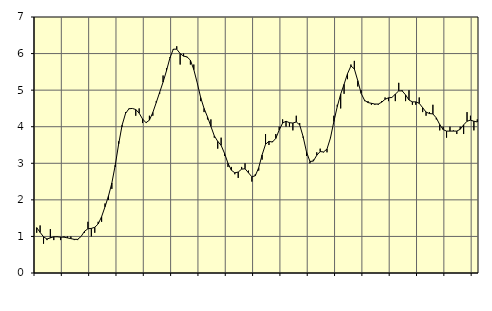
| Category | Piggar | Series 1 |
|---|---|---|
| nan | 1.1 | 1.24 |
| 87.0 | 1.3 | 1.11 |
| 87.0 | 0.8 | 0.99 |
| 87.0 | 0.9 | 0.93 |
| nan | 1.2 | 0.96 |
| 88.0 | 0.9 | 0.99 |
| 88.0 | 1 | 0.99 |
| 88.0 | 0.9 | 0.98 |
| nan | 1 | 0.98 |
| 89.0 | 1 | 0.96 |
| 89.0 | 1 | 0.94 |
| 89.0 | 0.9 | 0.92 |
| nan | 0.9 | 0.92 |
| 90.0 | 1 | 1 |
| 90.0 | 1.1 | 1.14 |
| 90.0 | 1.4 | 1.21 |
| nan | 1 | 1.22 |
| 91.0 | 1.1 | 1.25 |
| 91.0 | 1.4 | 1.34 |
| 91.0 | 1.4 | 1.54 |
| nan | 1.9 | 1.81 |
| 92.0 | 2 | 2.1 |
| 92.0 | 2.3 | 2.46 |
| 92.0 | 2.9 | 2.95 |
| nan | 3.6 | 3.53 |
| 93.0 | 4 | 4.04 |
| 93.0 | 4.4 | 4.36 |
| 93.0 | 4.5 | 4.49 |
| nan | 4.5 | 4.5 |
| 94.0 | 4.3 | 4.47 |
| 94.0 | 4.5 | 4.37 |
| 94.0 | 4.1 | 4.21 |
| nan | 4.1 | 4.11 |
| 95.0 | 4.3 | 4.18 |
| 95.0 | 4.3 | 4.39 |
| 95.0 | 4.7 | 4.66 |
| nan | 4.9 | 4.94 |
| 96.0 | 5.4 | 5.22 |
| 96.0 | 5.6 | 5.53 |
| 96.0 | 5.9 | 5.88 |
| nan | 6.1 | 6.12 |
| 97.0 | 6.2 | 6.12 |
| 97.0 | 5.7 | 6 |
| 97.0 | 6 | 5.93 |
| nan | 5.9 | 5.91 |
| 98.0 | 5.7 | 5.82 |
| 98.0 | 5.7 | 5.56 |
| 98.0 | 5.2 | 5.2 |
| nan | 4.7 | 4.8 |
| 99.0 | 4.4 | 4.5 |
| 99.0 | 4.2 | 4.27 |
| 99.0 | 4.2 | 4.01 |
| nan | 3.7 | 3.75 |
| 0.0 | 3.4 | 3.6 |
| 0.0 | 3.7 | 3.49 |
| 0.0 | 3.2 | 3.27 |
| nan | 2.9 | 3 |
| 1.0 | 2.9 | 2.81 |
| 1.0 | 2.7 | 2.74 |
| 1.0 | 2.6 | 2.76 |
| nan | 2.9 | 2.84 |
| 2.0 | 3 | 2.85 |
| 2.0 | 2.8 | 2.74 |
| 2.0 | 2.5 | 2.63 |
| nan | 2.7 | 2.66 |
| 3.0 | 2.8 | 2.88 |
| 3.0 | 3.1 | 3.23 |
| 3.0 | 3.8 | 3.52 |
| nan | 3.5 | 3.6 |
| 4.0 | 3.6 | 3.58 |
| 4.0 | 3.8 | 3.68 |
| 4.0 | 4 | 3.91 |
| nan | 4.2 | 4.1 |
| 5.0 | 4 | 4.15 |
| 5.0 | 4 | 4.11 |
| 5.0 | 3.9 | 4.1 |
| nan | 4.3 | 4.13 |
| 6.0 | 4.1 | 4.05 |
| 6.0 | 3.7 | 3.73 |
| 6.0 | 3.2 | 3.31 |
| nan | 3 | 3.05 |
| 7.0 | 3.1 | 3.06 |
| 7.0 | 3.3 | 3.22 |
| 7.0 | 3.4 | 3.32 |
| nan | 3.3 | 3.31 |
| 8.0 | 3.3 | 3.39 |
| 8.0 | 3.7 | 3.69 |
| 8.0 | 4.3 | 4.14 |
| nan | 4.6 | 4.55 |
| 9.0 | 4.5 | 4.89 |
| 9.0 | 4.9 | 5.16 |
| 9.0 | 5.3 | 5.45 |
| nan | 5.7 | 5.66 |
| 10.0 | 5.8 | 5.58 |
| 10.0 | 5.1 | 5.26 |
| 10.0 | 5 | 4.91 |
| nan | 4.7 | 4.72 |
| 11.0 | 4.7 | 4.66 |
| 11.0 | 4.6 | 4.64 |
| 11.0 | 4.6 | 4.62 |
| nan | 4.6 | 4.62 |
| 12.0 | 4.7 | 4.67 |
| 12.0 | 4.8 | 4.75 |
| 12.0 | 4.7 | 4.79 |
| nan | 4.8 | 4.8 |
| 13.0 | 4.7 | 4.89 |
| 13.0 | 5.2 | 4.98 |
| 13.0 | 5 | 4.98 |
| nan | 4.7 | 4.87 |
| 14.0 | 5 | 4.73 |
| 14.0 | 4.6 | 4.68 |
| 14.0 | 4.6 | 4.68 |
| nan | 4.8 | 4.64 |
| 15.0 | 4.4 | 4.52 |
| 15.0 | 4.3 | 4.4 |
| 15.0 | 4.4 | 4.36 |
| nan | 4.6 | 4.35 |
| 16.0 | 4.2 | 4.24 |
| 16.0 | 3.9 | 4.06 |
| 16.0 | 4 | 3.92 |
| nan | 3.7 | 3.88 |
| 17.0 | 4 | 3.88 |
| 17.0 | 3.9 | 3.88 |
| 17.0 | 3.8 | 3.88 |
| nan | 4 | 3.93 |
| 18.0 | 3.8 | 4.05 |
| 18.0 | 4.4 | 4.15 |
| 18.0 | 4.3 | 4.18 |
| nan | 3.9 | 4.15 |
| 19.0 | 4.2 | 4.13 |